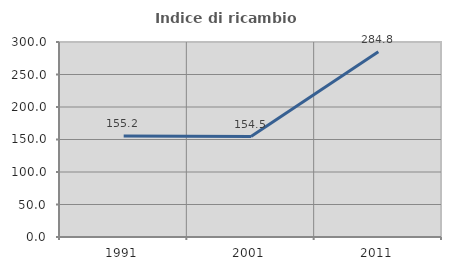
| Category | Indice di ricambio occupazionale  |
|---|---|
| 1991.0 | 155.249 |
| 2001.0 | 154.545 |
| 2011.0 | 284.848 |